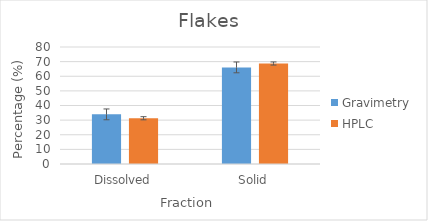
| Category | Gravimetry | HPLC |
|---|---|---|
| Dissolved | 33.939 | 31.28 |
| Solid | 66.061 | 68.72 |